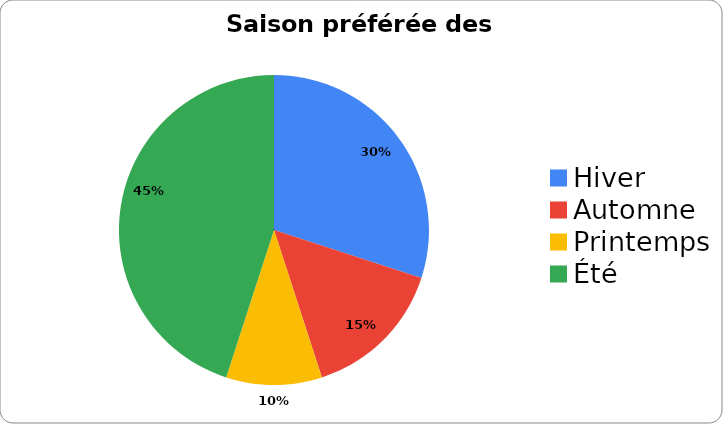
| Category | Series 0 |
|---|---|
| Hiver | 30 |
| Automne | 15 |
| Printemps | 10 |
| Été | 45 |